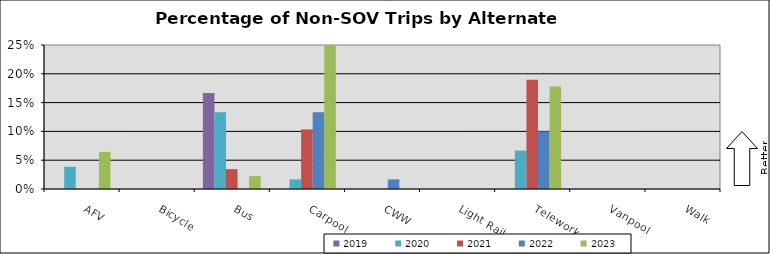
| Category | 2019 | 2020 | 2021 | 2022 | 2023 |
|---|---|---|---|---|---|
| AFV | 0 | 0.039 | 0 | 0 | 0.064 |
| Bicycle | 0 | 0 | 0 | 0 | 0 |
| Bus | 0.167 | 0.133 | 0.034 | 0 | 0.022 |
| Carpool | 0 | 0.017 | 0.103 | 0.133 | 0.267 |
| CWW | 0 | 0 | 0 | 0.017 | 0 |
| Light Rail | 0 | 0 | 0 | 0 | 0 |
| Telework | 0 | 0.067 | 0.19 | 0.1 | 0.178 |
| Vanpool | 0 | 0 | 0 | 0 | 0 |
| Walk | 0 | 0 | 0 | 0 | 0 |